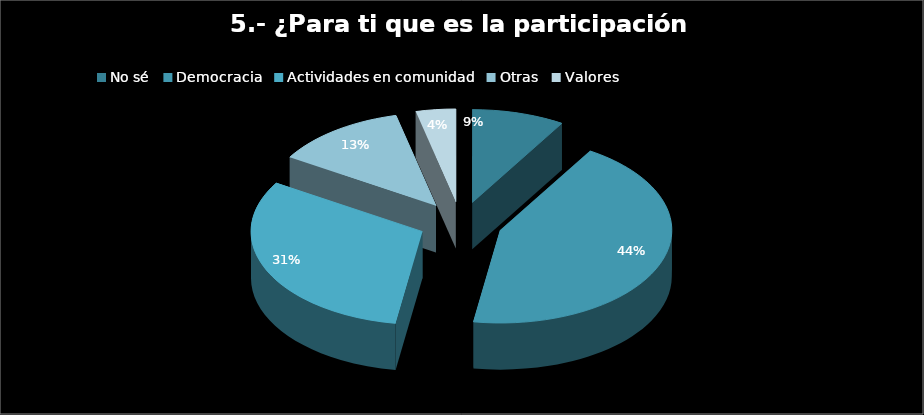
| Category | Series 0 |
|---|---|
| No sé | 7 |
| Democracia | 35 |
| Actividades en comunidad | 25 |
| Otras | 10 |
| Valores | 3 |